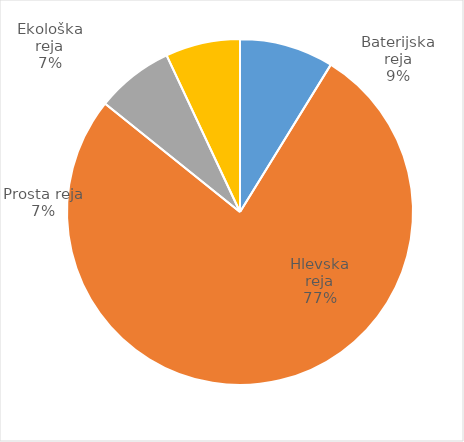
| Category | Število kosov jajc |
|---|---|
| Baterijska reja | 320192 |
| Hlevska reja | 2804022 |
| Prosta reja | 264317 |
| Ekološka reja | 254070 |